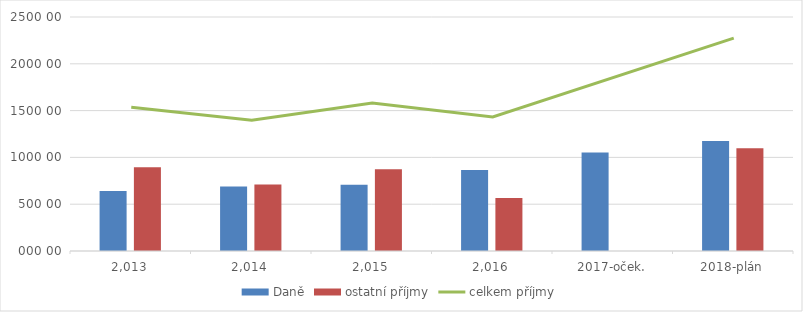
| Category | Daně | ostatní příjmy |
|---|---|---|
| 2013 | 64168.276 | 89472.981 |
| 2014 | 68876.667 | 70930.301 |
| 2015 | 70886.189 | 87313.297 |
| 2016 | 86513 | 56664.074 |
| 2017-oček. | 105237.846 | 0 |
| 2018-plán | 117651 | 109830.554 |